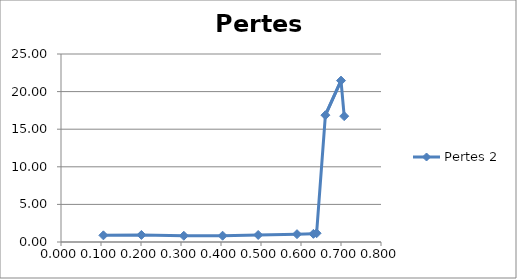
| Category | Pertes 2 |
|---|---|
| 0.708 | 16.733 |
| 0.7 | 21.462 |
| 0.661 | 16.865 |
| 0.639 | 1.165 |
| 0.631 | 1.084 |
| 0.59 | 1.043 |
| 0.493 | 0.934 |
| 0.404 | 0.836 |
| 0.307 | 0.831 |
| 0.201 | 0.94 |
| 0.106 | 0.886 |